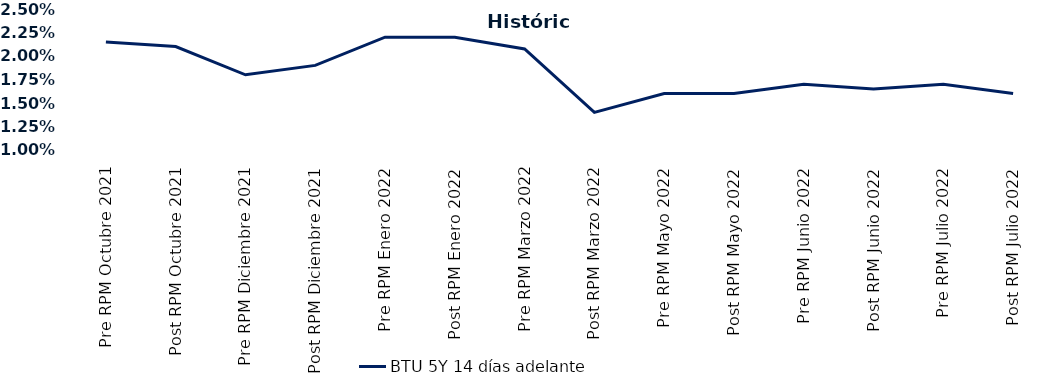
| Category | BTU 5Y 14 días adelante |
|---|---|
| Pre RPM Octubre 2021 | 0.022 |
| Post RPM Octubre 2021 | 0.021 |
| Pre RPM Diciembre 2021 | 0.018 |
| Post RPM Diciembre 2021 | 0.019 |
| Pre RPM Enero 2022 | 0.022 |
| Post RPM Enero 2022 | 0.022 |
| Pre RPM Marzo 2022 | 0.021 |
| Post RPM Marzo 2022 | 0.014 |
| Pre RPM Mayo 2022 | 0.016 |
| Post RPM Mayo 2022 | 0.016 |
| Pre RPM Junio 2022 | 0.017 |
| Post RPM Junio 2022 | 0.016 |
| Pre RPM Julio 2022 | 0.017 |
| Post RPM Julio 2022 | 0.016 |